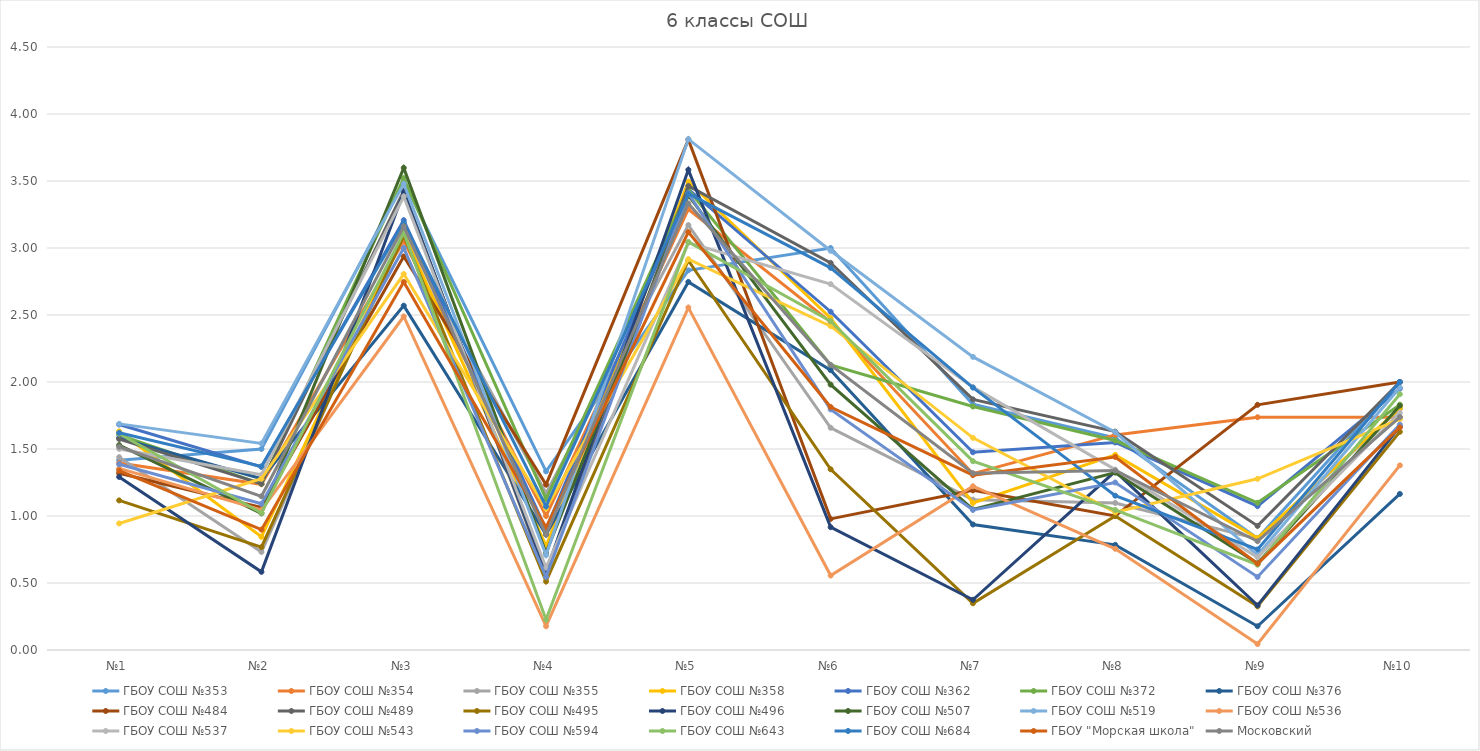
| Category | ГБОУ СОШ №353 | ГБОУ СОШ №354 | ГБОУ СОШ №355 | ГБОУ СОШ №358  | ГБОУ СОШ №362 | ГБОУ СОШ №372 | ГБОУ СОШ №376 | ГБОУ СОШ №484 | ГБОУ СОШ №489 | ГБОУ СОШ №495 | ГБОУ СОШ №496 | ГБОУ СОШ №507 | ГБОУ СОШ №519 | ГБОУ СОШ №536 | ГБОУ СОШ №537 | ГБОУ СОШ №543 | ГБОУ СОШ №594 | ГБОУ СОШ №643 | ГБОУ СОШ №684 | ГБОУ "Морская школа" | Московский |
|---|---|---|---|---|---|---|---|---|---|---|---|---|---|---|---|---|---|---|---|---|---|
| №1 | 1.417 | 1.395 | 1.439 | 1.631 | 1.683 | 1.606 | 1.582 | 1.319 | 1.574 | 1.116 | 1.292 | 1.529 | 1.688 | 1.356 | 1.5 | 0.944 | 1.386 | 1.614 | 1.621 | 1.339 | 1.517 |
| №2 | 1.5 | 1.237 | 0.732 | 0.845 | 1.366 | 1.239 | 1.278 | 1.064 | 1.241 | 0.767 | 0.583 | 1.02 | 1.542 | 1.044 | 1.308 | 1.278 | 1.091 | 1.023 | 1.37 | 0.898 | 1.147 |
| №3 | 3.5 | 3.053 | 3.122 | 3.107 | 3.207 | 3.521 | 2.57 | 2.936 | 3.426 | 3.093 | 3.417 | 3.598 | 3.479 | 2.489 | 3.385 | 2.806 | 3 | 3.114 | 3.189 | 2.746 | 3.162 |
| №4 | 1.333 | 1 | 1.171 | 0.777 | 0.902 | 1.127 | 0.861 | 1.234 | 0.556 | 0.512 | 0.583 | 0.725 | 0.708 | 0.178 | 0.615 | 1.056 | 0.545 | 0.227 | 1.071 | 0.915 | 0.862 |
| №5 | 2.833 | 3.289 | 3.171 | 3.495 | 3.439 | 3.437 | 2.747 | 3.809 | 3.463 | 2.907 | 3.583 | 3.392 | 3.812 | 2.556 | 3.038 | 2.917 | 3.409 | 3.045 | 3.405 | 3.119 | 3.333 |
| №6 | 3 | 2.447 | 1.659 | 2.476 | 2.524 | 2.127 | 2.089 | 0.979 | 2.889 | 1.349 | 0.917 | 1.98 | 2.979 | 0.556 | 2.731 | 2.417 | 1.795 | 2.455 | 2.852 | 1.814 | 2.128 |
| №7 | 1.833 | 1.316 | 1.122 | 1.097 | 1.476 | 1.817 | 0.937 | 1.191 | 1.87 | 0.349 | 0.375 | 1.049 | 2.188 | 1.222 | 1.962 | 1.583 | 1.045 | 1.409 | 1.958 | 1.305 | 1.319 |
| №8 | 1.583 | 1.605 | 1.098 | 1.456 | 1.549 | 1.563 | 0.785 | 1 | 1.63 | 1 | 1.333 | 1.324 | 1.625 | 0.756 | 1.346 | 1.028 | 1.25 | 1.045 | 1.152 | 1.441 | 1.339 |
| №9 | 0.833 | 1.737 | 0.829 | 0.835 | 1.073 | 1.099 | 0.177 | 1.83 | 0.926 | 0.326 | 0.333 | 0.647 | 0.708 | 0.044 | 0.692 | 1.278 | 0.545 | 0.636 | 0.75 | 0.644 | 0.812 |
| №10 | 2 | 1.737 | 1.8 | 1.806 | 1.951 | 1.831 | 1.165 | 2 | 2 | 1.628 | 1.667 | 1.824 | 1.958 | 1.378 | 1.769 | 1.722 | 1.682 | 1.909 | 2 | 1.661 | 1.738 |